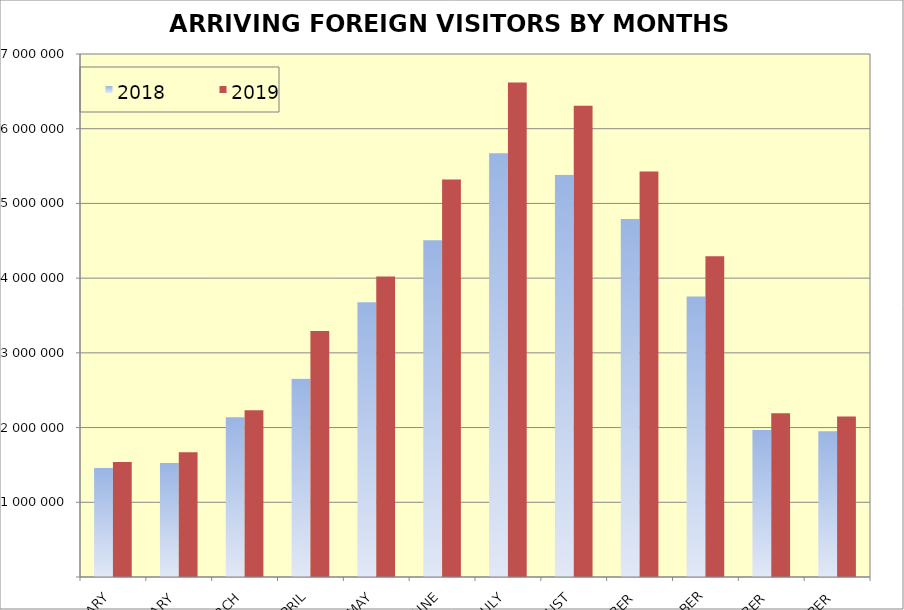
| Category | 2018 | 2019 |
|---|---|---|
| JANUARY | 1461570 | 1539496 |
| FEBRUARY | 1527070 | 1670238 |
| MARCH | 2139766 | 2232358 |
| APRIL | 2655561 | 3293176 |
| MAY | 3678440 | 4022254 |
| JUNE | 4505594 | 5318984 |
| JULY | 5671801 | 6617380 |
| AUGUST | 5383332 | 6307508 |
| SEPTEMBER | 4792818 | 5426818 |
| OCTOBER | 3755467 | 4291574 |
| NOVEMBER | 1966277 | 2190622 |
| DECEMBER | 1950705 | 2147878 |